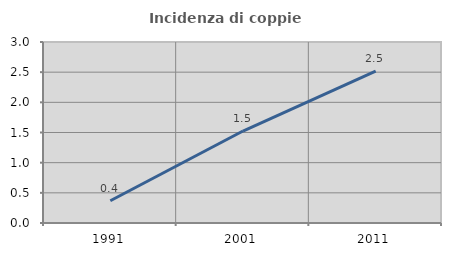
| Category | Incidenza di coppie miste |
|---|---|
| 1991.0 | 0.369 |
| 2001.0 | 1.525 |
| 2011.0 | 2.518 |